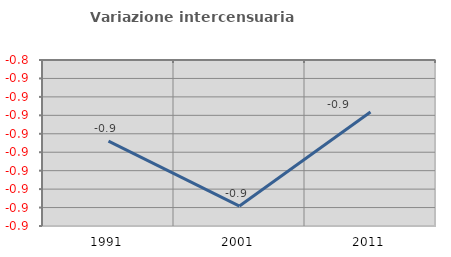
| Category | Variazione intercensuaria annua |
|---|---|
| 1991.0 | -0.884 |
| 2001.0 | -0.919 |
| 2011.0 | -0.868 |